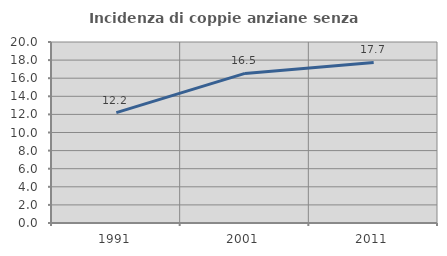
| Category | Incidenza di coppie anziane senza figli  |
|---|---|
| 1991.0 | 12.195 |
| 2001.0 | 16.526 |
| 2011.0 | 17.739 |